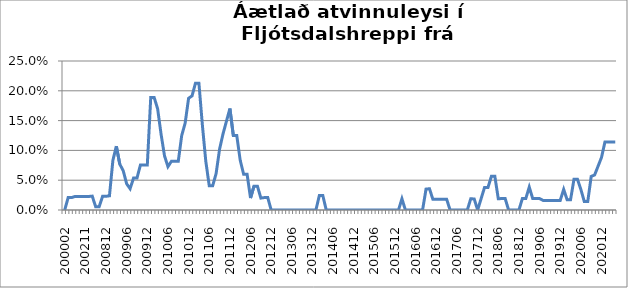
| Category | Series 0 |
|---|---|
| 200002 | 0 |
| 200102 | 0.021 |
| 200103 | 0.021 |
| 200111 | 0.023 |
| 200112 | 0.023 |
| 200201 | 0.023 |
| 200211 | 0.023 |
| 200212 | 0.023 |
| 200302 | 0.023 |
| 200409 | 0.005 |
| 200410 | 0.005 |
| 200811 | 0.023 |
| 200812 | 0.023 |
| 200901 | 0.024 |
| 200902 | 0.083 |
| 200903 | 0.107 |
| 200904 | 0.077 |
| 200905 | 0.066 |
| 200906 | 0.044 |
| 200907 | 0.036 |
| 200908 | 0.054 |
| 200909 | 0.054 |
| 200910 | 0.075 |
| 200911 | 0.075 |
| 200912 | 0.075 |
| 201001 | 0.189 |
| 201002 | 0.189 |
| 201003 | 0.17 |
| 201004 | 0.127 |
| 201005 | 0.091 |
| 201006 | 0.073 |
| 201007 | 0.082 |
| 201008 | 0.082 |
| 201009 | 0.082 |
| 201010 | 0.125 |
| 201011 | 0.146 |
| 201012 | 0.188 |
| 201101 | 0.191 |
| 201102 | 0.213 |
| 201103 | 0.213 |
| 201104 | 0.143 |
| 201105 | 0.082 |
| 201106 | 0.041 |
| 201107 | 0.041 |
| 201108 | 0.061 |
| 201109 | 0.102 |
| 201110 | 0.128 |
| 201111 | 0.149 |
| 201112 | 0.17 |
| 201201 | 0.125 |
| 201202 | 0.125 |
| 201203 | 0.083 |
| 201204 | 0.06 |
| 201205 | 0.06 |
| 201206 | 0.02 |
| 201207 | 0.04 |
| 201208 | 0.04 |
| 201209 | 0.02 |
| 201210 | 0.021 |
| 201211 | 0.021 |
| 201212 | 0 |
| 201301 | 0 |
| 201302 | 0 |
| 201303 | 0 |
| 201304 | 0 |
| 201305 | 0 |
| 201306 | 0 |
| 201307 | 0 |
| 201308 | 0 |
| 201309 | 0 |
| 201310 | 0 |
| 201311 | 0 |
| 201312 | 0 |
| 201401 | 0 |
| 201402 | 0.024 |
| 201403 | 0.024 |
| 201404 | 0 |
| 201405 | 0 |
| 201406 | 0 |
| 201407 | 0 |
| 201408 | 0 |
| 201409 | 0 |
| 201410 | 0 |
| 201411 | 0 |
| 201412 | 0 |
| 201501 | 0 |
| 201502 | 0 |
| 201503 | 0 |
| 201504 | 0 |
| 201505 | 0 |
| 201506 | 0 |
| 201507 | 0 |
| 201508 | 0 |
| 201509 | 0 |
| 201510 | 0 |
| 201511 | 0 |
| 201512 | 0 |
| 201601 | 0 |
| 201602 | 0.019 |
| 201603 | 0 |
| 201604 | 0 |
| 201605 | 0 |
| 201606 | 0 |
| 201607 | 0 |
| 201608 | 0 |
| 201609 | 0.035 |
| 201610 | 0.036 |
| 201611 | 0.018 |
| 201612 | 0.018 |
| 201701 | 0.018 |
| 201702 | 0.018 |
| 201703 | 0.018 |
| 201704 | 0 |
| 201705 | 0 |
| 201706 | 0 |
| 201707 | 0 |
| 201708 | 0 |
| 201709 | 0 |
| 201710 | 0.019 |
| 201711 | 0.019 |
| 201712 | 0 |
| 201801 | 0.019 |
| 201802 | 0.038 |
| 201803 | 0.038 |
| 201804 | 0.057 |
| 201805 | 0.057 |
| 201806 | 0.019 |
| 201807 | 0.019 |
| 201808 | 0.019 |
| 201809 | 0 |
| 201810 | 0 |
| 201811 | 0 |
| 201812 | 0 |
| 201901 | 0.019 |
| 201902 | 0.019 |
| 201903 | 0.038 |
| 201904 | 0.019 |
| 201905 | 0.019 |
| 201906 | 0.019 |
| 201907 | 0.016 |
| 201908 | 0.016 |
| 201909 | 0.016 |
| 201910 | 0.016 |
| 201911 | 0.016 |
| 201912 | 0.016 |
| 202001 | 0.034 |
| 202002 | 0.017 |
| 202003*** | 0.017 |
| 202004 | 0.052 |
| 202005 | 0.052 |
| 202006 | 0.034 |
| 202007 | 0.014 |
| 202008 | 0.014 |
| 202009 | 0.056 |
| 202010 | 0.059 |
| 202011 | 0.074 |
| 202012 | 0.088 |
| 202101 | 0.114 |
| 202102 | 0.114 |
| 202103 | 0.114 |
| 202104 | 0.114 |